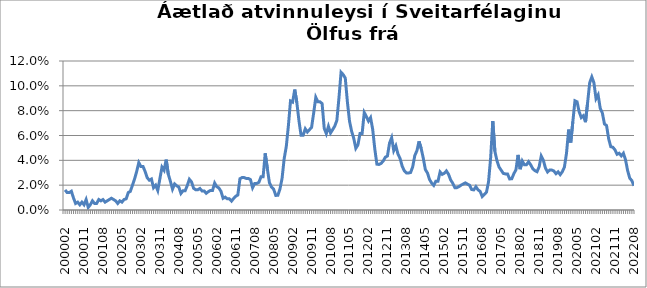
| Category | Series 0 |
|---|---|
| 200002 | 0.016 |
| 200003 | 0.014 |
| 200004 | 0.014 |
| 200005 | 0.015 |
| 200006 | 0.01 |
| 200007 | 0.005 |
| 200008 | 0.006 |
| 200009 | 0.004 |
| 200010 | 0.006 |
| 200011 | 0.004 |
| 200012 | 0.008 |
| 200101 | 0.002 |
| 200102 | 0.004 |
| 200103 | 0.007 |
| 200104 | 0.005 |
| 200105 | 0.005 |
| 200106 | 0.008 |
| 200107 | 0.007 |
| 200108 | 0.008 |
| 200109 | 0.006 |
| 200110 | 0.007 |
| 200111 | 0.008 |
| 200112 | 0.009 |
| 200201 | 0.008 |
| 200202 | 0.007 |
| 200203 | 0.005 |
| 200204 | 0.007 |
| 200205 | 0.006 |
| 200206 | 0.008 |
| 200207 | 0.009 |
| 200208 | 0.014 |
| 200209 | 0.015 |
| 200210 | 0.02 |
| 200211 | 0.025 |
| 200212 | 0.031 |
| 200301 | 0.038 |
| 200302 | 0.035 |
| 200303 | 0.035 |
| 200304 | 0.031 |
| 200305 | 0.026 |
| 200306 | 0.024 |
| 200307 | 0.025 |
| 200308 | 0.018 |
| 200309 | 0.02 |
| 200310 | 0.016 |
| 200311 | 0.025 |
| 200312 | 0.035 |
| 200401 | 0.032 |
| 200402 | 0.041 |
| 200403 | 0.029 |
| 200404 | 0.023 |
| 200405 | 0.017 |
| 200406 | 0.021 |
| 200407 | 0.019 |
| 200408 | 0.018 |
| 200409 | 0.013 |
| 200410 | 0.016 |
| 200411 | 0.016 |
| 200412 | 0.02 |
| 200501 | 0.025 |
| 200502 | 0.023 |
| 200503 | 0.018 |
| 200504 | 0.016 |
| 200505 | 0.016 |
| 200506 | 0.017 |
| 200507 | 0.015 |
| 200508 | 0.015 |
| 200509 | 0.013 |
| 200510 | 0.015 |
| 200511 | 0.016 |
| 200512 | 0.016 |
| 200601 | 0.022 |
| 200602 | 0.019 |
| 200603 | 0.018 |
| 200604 | 0.015 |
| 200605 | 0.009 |
| 200606 | 0.01 |
| 200607 | 0.009 |
| 200608 | 0.009 |
| 200609 | 0.007 |
| 200610 | 0.009 |
| 200611 | 0.011 |
| 200612 | 0.012 |
| 200701 | 0.025 |
| 200702 | 0.026 |
| 200703 | 0.026 |
| 200704 | 0.025 |
| 200705 | 0.025 |
| 200706 | 0.024 |
| 200707 | 0.018 |
| 200708 | 0.021 |
| 200709 | 0.021 |
| 200710 | 0.022 |
| 200711 | 0.027 |
| 200712 | 0.027 |
| 200801 | 0.046 |
| 200802 | 0.033 |
| 200803 | 0.022 |
| 200804 | 0.018 |
| 200805 | 0.017 |
| 200806 | 0.012 |
| 200807 | 0.012 |
| 200808 | 0.017 |
| 200809 | 0.025 |
| 200810 | 0.041 |
| 200811 | 0.051 |
| 200812 | 0.068 |
| 200901 | 0.088 |
| 200902 | 0.087 |
| 200903 | 0.097 |
| 200904 | 0.087 |
| 200905 | 0.072 |
| 200906 | 0.06 |
| 200907 | 0.06 |
| 200908 | 0.065 |
| 200909 | 0.063 |
| 200910 | 0.065 |
| 200911 | 0.066 |
| 200912 | 0.078 |
| 201001 | 0.091 |
| 201002 | 0.087 |
| 201003 | 0.087 |
| 201004 | 0.086 |
| 201005 | 0.066 |
| 201006 | 0.061 |
| 201007 | 0.067 |
| 201008 | 0.062 |
| 201009 | 0.065 |
| 201010 | 0.068 |
| 201011 | 0.072 |
| 201012 | 0.09 |
| 201101 | 0.111 |
| 201102 | 0.109 |
| 201103 | 0.106 |
| 201104 | 0.087 |
| 201105 | 0.072 |
| 201106 | 0.063 |
| 201107 | 0.058 |
| 201108 | 0.05 |
| 201109 | 0.052 |
| 201110 | 0.062 |
| 201111 | 0.062 |
| 201112 | 0.079 |
| 201201 | 0.075 |
| 201202 | 0.072 |
| 201203 | 0.074 |
| 201204 | 0.065 |
| 201205 | 0.049 |
| 201206 | 0.037 |
| 201207 | 0.037 |
| 201208 | 0.038 |
| 201209 | 0.039 |
| 201210 | 0.043 |
| 201211 | 0.043 |
| 201212 | 0.054 |
| 201301 | 0.058 |
| 201302 | 0.048 |
| 201303 | 0.052 |
| 201304 | 0.045 |
| 201305 | 0.042 |
| 201306 | 0.035 |
| 201307 | 0.032 |
| 201308 | 0.03 |
| 201309 | 0.03 |
| 201310 | 0.03 |
| 201311 | 0.035 |
| 201312 | 0.044 |
| 201401 | 0.048 |
| 201402 | 0.055 |
| 201403 | 0.05 |
| 201404 | 0.042 |
| 201405 | 0.033 |
| 201406 | 0.03 |
| 201407 | 0.024 |
| 201408 | 0.022 |
| 201409 | 0.02 |
| 201410 | 0.023 |
| 201411 | 0.023 |
| 201412 | 0.031 |
| 201501 | 0.029 |
| 201502 | 0.03 |
| 201503 | 0.031 |
| 201504 | 0.029 |
| 201505 | 0.024 |
| 201506 | 0.022 |
| 201507 | 0.018 |
| 201508 | 0.018 |
| 201509 | 0.019 |
| 201510 | 0.02 |
| 201511 | 0.021 |
| 201512 | 0.022 |
| 201601 | 0.021 |
| 201602 | 0.02 |
| 201603 | 0.016 |
| 201604 | 0.016 |
| 201605 | 0.019 |
| 201606 | 0.016 |
| 201607 | 0.015 |
| 201608 | 0.011 |
| 201609 | 0.013 |
| 201610 | 0.014 |
| 201611 | 0.023 |
| 201612 | 0.042 |
| 201701 | 0.072 |
| 201702 | 0.047 |
| 201703 | 0.04 |
| 201704 | 0.035 |
| 201705 | 0.032 |
| 201706 | 0.029 |
| 201707 | 0.029 |
| 201708 | 0.029 |
| 201709 | 0.025 |
| 201710 | 0.025 |
| 201711 | 0.029 |
| 201712 | 0.032 |
| 201801 | 0.044 |
| 201802 | 0.033 |
| 201803 | 0.039 |
| 201804 | 0.036 |
| 201805 | 0.036 |
| 201806 | 0.039 |
| 201807 | 0.036 |
| 201808 | 0.033 |
| 201809 | 0.032 |
| 201810 | 0.031 |
| 201811 | 0.035 |
| 201812 | 0.043 |
| 201901 | 0.04 |
| 201902 | 0.034 |
| 201903 | 0.031 |
| 201904 | 0.032 |
| 201905 | 0.032 |
| 201906 | 0.031 |
| 201907 | 0.029 |
| 201908 | 0.031 |
| 201909 | 0.028 |
| 201910 | 0.031 |
| 201911 | 0.035 |
| 201912 | 0.046 |
| 202001 | 0.065 |
| 202002 | 0.054 |
| 202003 | 0.071 |
| 202004 | 0.088 |
| 202005 | 0.087 |
| 202006 | 0.079 |
| 202007 | 0.074 |
| 202008 | 0.076 |
| 202009 | 0.071 |
| 202010 | 0.086 |
| 202011 | 0.103 |
| 202012 | 0.107 |
| 202101 | 0.102 |
| 202102 | 0.09 |
| 202103 | 0.093 |
| 202104 | 0.082 |
| 202105 | 0.078 |
| 202106 | 0.069 |
| 202107 | 0.068 |
| 202108 | 0.057 |
| 202109 | 0.051 |
| 202110 | 0.051 |
| 202111 | 0.048 |
| 202112 | 0.045 |
| 202201 | 0.046 |
| 202202 | 0.044 |
| 202203 | 0.046 |
| 202204 | 0.041 |
| 202205 | 0.032 |
| 202206 | 0.026 |
| 202207 | 0.024 |
| 202208 | 0.02 |